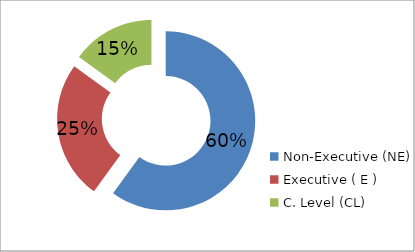
| Category | Series 0 |
|---|---|
| Non-Executive (NE) | 0.6 |
| Executive ( E ) | 0.25 |
| C. Level (CL) | 0.15 |